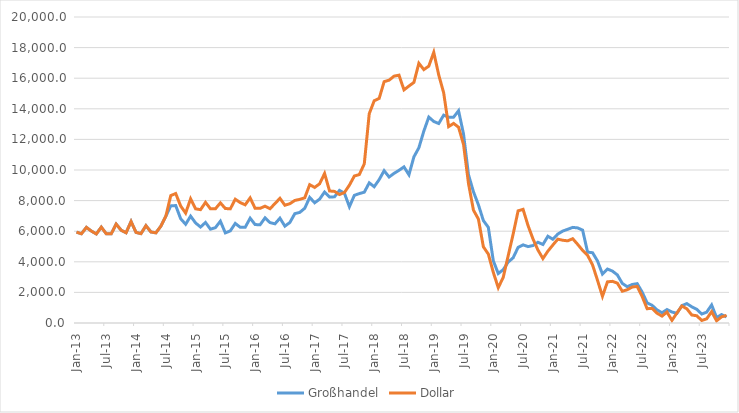
| Category | Großhandel | Dollar |
|---|---|---|
| 1913-01-15 | 5940.3 | 5940.3 |
| 1913-02-14 12:00:00 | 5834.3 | 5834.3 |
| 1913-03-17 | 6249.3 | 6249.3 |
| 1913-04-16 12:00:00 | 6009.2 | 6009.2 |
| 1913-05-17 | 5821.1 | 5821.1 |
| 1913-06-16 12:00:00 | 6264 | 6264 |
| 1913-07-17 | 5831.9 | 5831.9 |
| 1913-08-16 12:00:00 | 5830 | 5830 |
| 1913-09-16 | 6463.3 | 6463.3 |
| 1913-10-16 12:00:00 | 6064.9 | 6064.9 |
| 1913-11-16 | 5900.1 | 5900.1 |
| 1913-12-16 12:00:00 | 6631.9 | 6631.9 |
| 1914-01-16 | 5923.4 | 5923.4 |
| 1914-02-15 12:00:00 | 5842.1 | 5842.1 |
| 1914-03-18 | 6361.4 | 6361.4 |
| 1914-04-17 12:00:00 | 5950.4 | 5950.4 |
| 1914-05-18 | 5893.5 | 5893.5 |
| 1914-06-17 12:00:00 | 6323 | 6323 |
| 1914-07-18 | 6968.9 | 6968.9 |
| 1914-08-17 12:00:00 | 7654.6 | 8328.2 |
| 1914-09-17 | 7676.3 | 8461.7 |
| 1914-10-17 12:00:00 | 6813.8 | 7643.5 |
| 1914-11-17 | 6454.6 | 7184.2 |
| 1914-12-17 12:00:00 | 6984.8 | 8118.5 |
| 1915-01-17 | 6539.9 | 7463.1 |
| 1915-02-16 12:00:00 | 6271.8 | 7407.6 |
| 1915-03-19 | 6569.7 | 7887.1 |
| 1915-04-18 12:00:00 | 6131.6 | 7460.6 |
| 1915-05-19 | 6231.5 | 7464.8 |
| 1915-06-18 12:00:00 | 6653.5 | 7851.2 |
| 1915-07-19 | 5888 | 7483.2 |
| 1915-08-18 12:00:00 | 6021.6 | 7461.4 |
| 1915-09-18 | 6507.6 | 8090.8 |
| 1915-10-18 12:00:00 | 6256.6 | 7869.5 |
| 1915-11-18 | 6255.8 | 7725.6 |
| 1915-12-18 12:00:00 | 6850.8 | 8176.8 |
| 1916-01-18 | 6433.5 | 7494.8 |
| 1916-02-17 12:00:00 | 6420.6 | 7494.1 |
| 1916-03-19 | 6871.3 | 7636 |
| 1916-04-18 12:00:00 | 6561.6 | 7471.5 |
| 1916-05-19 | 6482.3 | 7802.7 |
| 1916-06-18 12:00:00 | 6850.8 | 8151.6 |
| 1916-07-19 | 6331.3 | 7696.3 |
| 1916-08-18 12:00:00 | 6568.7 | 7798.3 |
| 1916-09-18 | 7146.6 | 8009.9 |
| 1916-10-18 12:00:00 | 7228.8 | 8081.1 |
| 1916-11-18 | 7500.1 | 8181.4 |
| 1916-12-18 12:00:00 | 8209.6 | 9041.4 |
| 1917-01-18 | 7857.9 | 8860.8 |
| 1917-02-17 12:00:00 | 8097 | 9099 |
| 1917-03-20 | 8561.6 | 9772.3 |
| 1917-04-19 12:00:00 | 8228.7 | 8628.6 |
| 1917-05-20 | 8247 | 8601.4 |
| 1917-06-19 12:00:00 | 8668 | 8396.5 |
| 1917-07-20 | 8481.8 | 8531.7 |
| 1917-08-19 12:00:00 | 7599.4 | 9008.4 |
| 1917-09-19 | 8344.1 | 9608.4 |
| 1917-10-19 12:00:00 | 8459.5 | 9702.1 |
| 1917-11-19 | 8548.7 | 10400.2 |
| 1917-12-19 12:00:00 | 9160 | 13682.4 |
| 1918-01-19 | 8906.5 | 14525.9 |
| 1918-02-18 12:00:00 | 9372.5 | 14678.1 |
| 1918-03-21 | 9953.6 | 15773.2 |
| 1918-04-20 12:00:00 | 9542.1 | 15872.2 |
| 1918-05-21 | 9781.2 | 16134.2 |
| 1918-06-20 12:00:00 | 9979.9 | 16197.7 |
| 1918-07-21 | 10204.2 | 15236 |
| 1918-08-20 12:00:00 | 9686.6 | 15487.9 |
| 1918-09-20 | 10859.6 | 15725.2 |
| 1918-10-20 12:00:00 | 11450.9 | 16976.2 |
| 1918-11-20 | 12540.8 | 16562.7 |
| 1918-12-20 12:00:00 | 13457.8 | 16788.1 |
| 1919-01-20 | 13171.6 | 17692.6 |
| 1919-02-19 12:00:00 | 13037.8 | 16216.3 |
| 1919-03-22 | 13585.1 | 15045.1 |
| 1919-04-21 12:00:00 | 13453.5 | 12834.9 |
| 1919-05-22 | 13453.6 | 13044.7 |
| 1919-06-21 12:00:00 | 13872.8 | 12796.1 |
| 1919-07-22 | 12353.6 | 11669 |
| 1919-08-21 12:00:00 | 9689.7 | 9117.1 |
| 1919-09-21 | 8579.8 | 7375.8 |
| 1919-10-21 12:00:00 | 7724.6 | 6793.6 |
| 1919-11-21 | 6694.7 | 4978.8 |
| 1919-12-21 12:00:00 | 6252.1 | 4503.9 |
| 1920-01-21 | 4066.8 | 3310.6 |
| 1920-02-20 12:00:00 | 3231.8 | 2307.8 |
| 1920-03-22 | 3487.8 | 2984.2 |
| 1920-04-21 12:00:00 | 3983.7 | 4396 |
| 1920-05-22 | 4263.6 | 5809.7 |
| 1920-06-21 12:00:00 | 4942.8 | 7331.7 |
| 1920-07-22 | 5107.8 | 7428.1 |
| 1920-08-21 12:00:00 | 4993.4 | 6369.7 |
| 1920-09-21 | 5062.2 | 5493 |
| 1920-10-21 12:00:00 | 5278.3 | 4767.4 |
| 1920-11-21 | 5131.1 | 4210.4 |
| 1920-12-21 12:00:00 | 5668.6 | 4696.4 |
| 1921-01-21 | 5473.5 | 5096.3 |
| 1921-02-20 12:00:00 | 5813.6 | 5479.8 |
| 1921-03-23 | 6009.9 | 5408 |
| 1921-04-22 12:00:00 | 6125.2 | 5369.5 |
| 1921-05-23 | 6248.9 | 5510.4 |
| 1921-06-22 12:00:00 | 6215.4 | 5141.2 |
| 1921-07-23 | 6068.9 | 4745.3 |
| 1921-08-22 12:00:00 | 4634 | 4425.3 |
| 1921-09-22 | 4593.2 | 3800.8 |
| 1921-10-22 12:00:00 | 4057.4 | 2791 |
| 1921-11-22 | 3198.5 | 1744.3 |
| 1921-12-22 12:00:00 | 3526.3 | 2689.5 |
| 1922-01-22 | 3395 | 2723.2 |
| 1922-02-21 12:00:00 | 3144.4 | 2606.1 |
| 1922-03-24 | 2585.9 | 2075.3 |
| 1922-04-23 12:00:00 | 2372.2 | 2174.8 |
| 1922-05-24 | 2517 | 2352.1 |
| 1922-06-23 12:00:00 | 2571.4 | 2390.6 |
| 1922-07-24 | 2020.5 | 1730 |
| 1922-08-23 12:00:00 | 1316.8 | 935.6 |
| 1922-09-23 | 1158.3 | 952.4 |
| 1922-10-23 12:00:00 | 856.3 | 639.7 |
| 1922-11-23 | 668.5 | 449.7 |
| 1922-12-23 12:00:00 | 878.2 | 716.5 |
| 1923-01-23 | 718 | 171.3 |
| 1923-02-22 12:00:00 | 633.2 | 654 |
| 1923-03-25 | 1133.9 | 1109.4 |
| 1923-04-24 12:00:00 | 1267.3 | 930.4 |
| 1923-05-25 | 1058 | 522.1 |
| 1923-06-24 12:00:00 | 897.2 | 472.6 |
| 1923-07-25 | 586.9 | 167.5 |
| 1923-08-24 12:00:00 | 708.4 | 272.6 |
| 1923-09-24 | 1179.4 | 741.1 |
| 1923-10-24 12:00:00 | 353.1 | 145 |
| 1923-11-24 | 551.7 | 400.3 |
| 1923-12-24 12:00:00 | 393.6 | 496.6 |